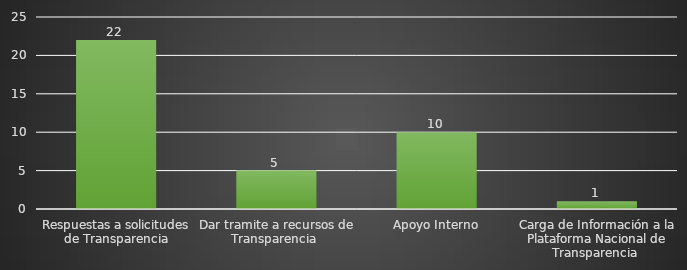
| Category | INDICADOR  |
|---|---|
| Respuestas a solicitudes de Transparencia | 22 |
| Dar tramite a recursos de Transparencia  | 5 |
| Apoyo Interno | 10 |
| Carga de Información a la Plataforma Nacional de Transparencia  | 1 |